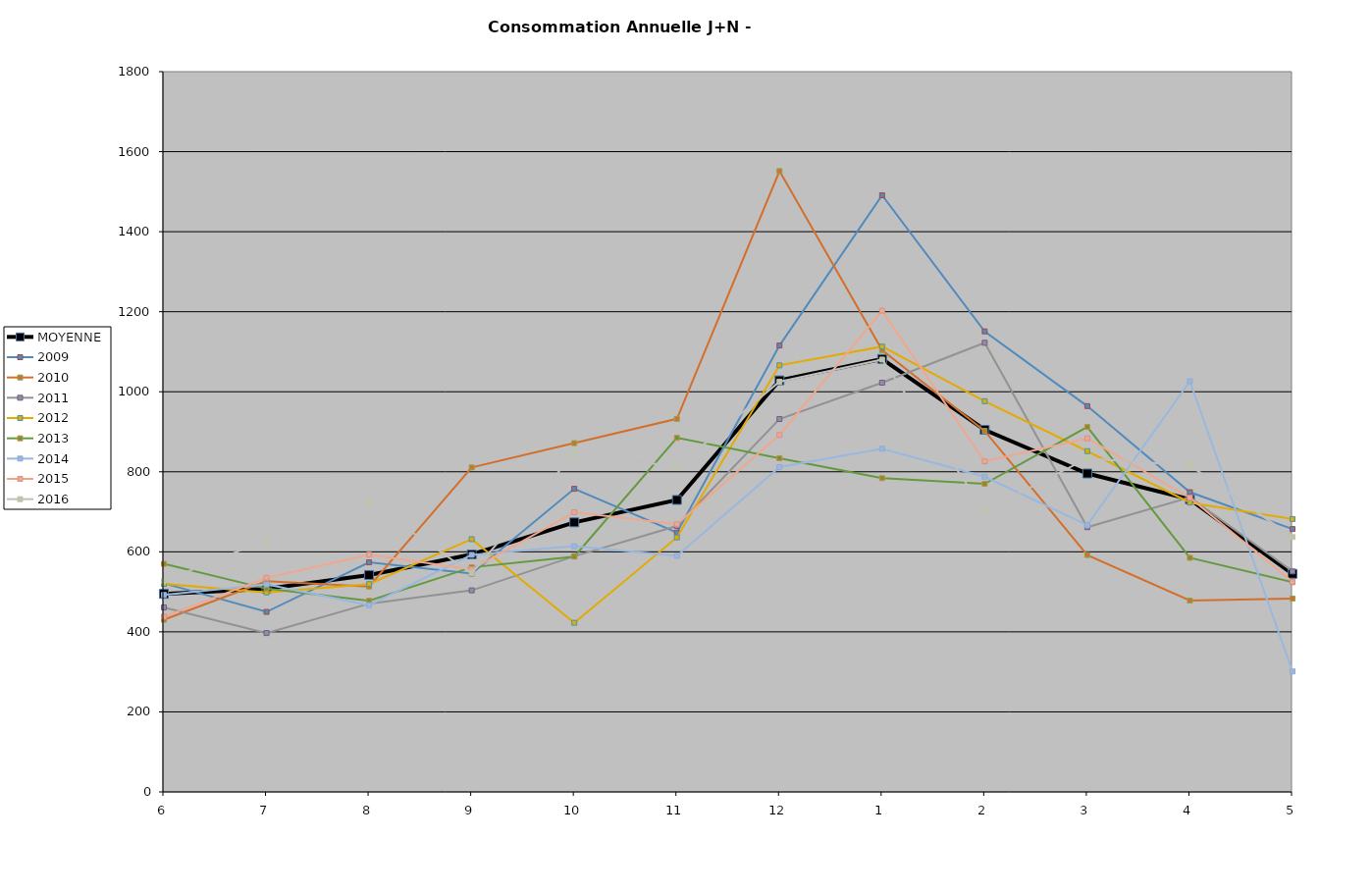
| Category | MOYENNE | 2009 | 2010 | 2011 | 2012 | 2013 | 2014 | 2015 | 2016 |
|---|---|---|---|---|---|---|---|---|---|
| 6 | 494.875 | 521.471 | 430.25 | 461 | 519.812 | 570 | 492.5 | 438 | 526.923 |
| 7 | 507.75 | 449.912 | 526.464 | 396.972 | 498.488 | 508 | 518.5 | 535 | 629.855 |
| 8 | 542.125 | 573.697 | 513.286 | 470.494 | 519.45 | 477.714 | 466.632 | 592.78 | 722.865 |
| 9 | 593.5 | 545.538 | 810.909 | 503.667 | 631.625 | 561.286 | 592.368 | 556.02 | 546.357 |
| 10 | 673.625 | 757.562 | 871.624 | 588.967 | 422.625 | 588.031 | 614 | 698.83 | 846 |
| 11 | 729.625 | 647.938 | 932.342 | 664.436 | 636 | 884.969 | 590 | 668.854 | 812.727 |
| 12 | 1028.5 | 1115.5 | 1551.47 | 931.839 | 1066 | 834 | 811.636 | 892.065 | 1025.273 |
| 1 | 1082 | 1491 | 1104.222 | 1022.625 | 1113 | 784 | 857.597 | 1202.548 | 1080.441 |
| 2 | 904.875 | 1150.8 | 902.033 | 1122.4 | 976.387 | 770 | 787.767 | 825.903 | 703.559 |
| 3 | 795.75 | 964.2 | 592 | 661.6 | 851.613 | 912 | 666.8 | 883.5 | 833.242 |
| 4 | 731 | 749.062 | 478.15 | 736 | 723 | 585 | 1026.2 | 735.133 | 815.758 |
| 5 | 545 | 656.938 | 483.25 | 551 | 682 | 524 | 301 | 525.367 | 637 |